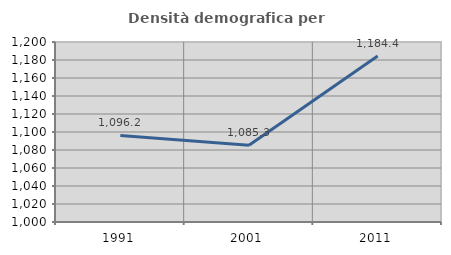
| Category | Densità demografica |
|---|---|
| 1991.0 | 1096.229 |
| 2001.0 | 1085.287 |
| 2011.0 | 1184.373 |